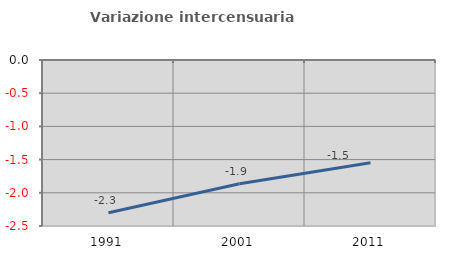
| Category | Variazione intercensuaria annua |
|---|---|
| 1991.0 | -2.301 |
| 2001.0 | -1.864 |
| 2011.0 | -1.549 |